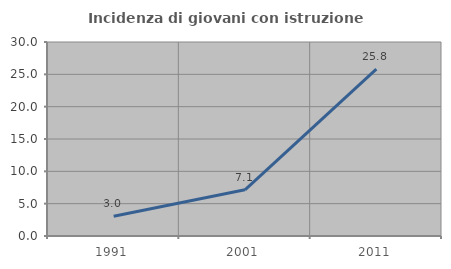
| Category | Incidenza di giovani con istruzione universitaria |
|---|---|
| 1991.0 | 3.043 |
| 2001.0 | 7.143 |
| 2011.0 | 25.806 |